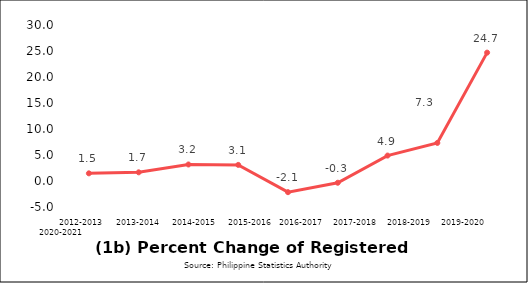
| Category | Series 0 |
|---|---|
| 2012-2013 | 1.474 |
| 2013-2014 | 1.668 |
| 2014-2015 | 3.177 |
| 2015-2016 | 3.098 |
| 2016-2017 | -2.15 |
| 2017-2018 | -0.336 |
| 2018-2019 | 4.891 |
| 2019-2020 | 7.323 |
| 2020-2021 | 24.685 |